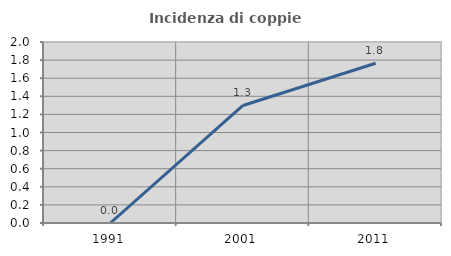
| Category | Incidenza di coppie miste |
|---|---|
| 1991.0 | 0 |
| 2001.0 | 1.299 |
| 2011.0 | 1.765 |